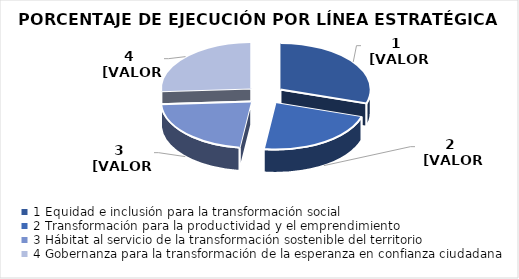
| Category | PORCENTAJE DE EJECUCIÓN |
|---|---|
| 0 | 0.942 |
| 1 | 0.7 |
| 2 | 0.694 |
| 3 | 0.819 |